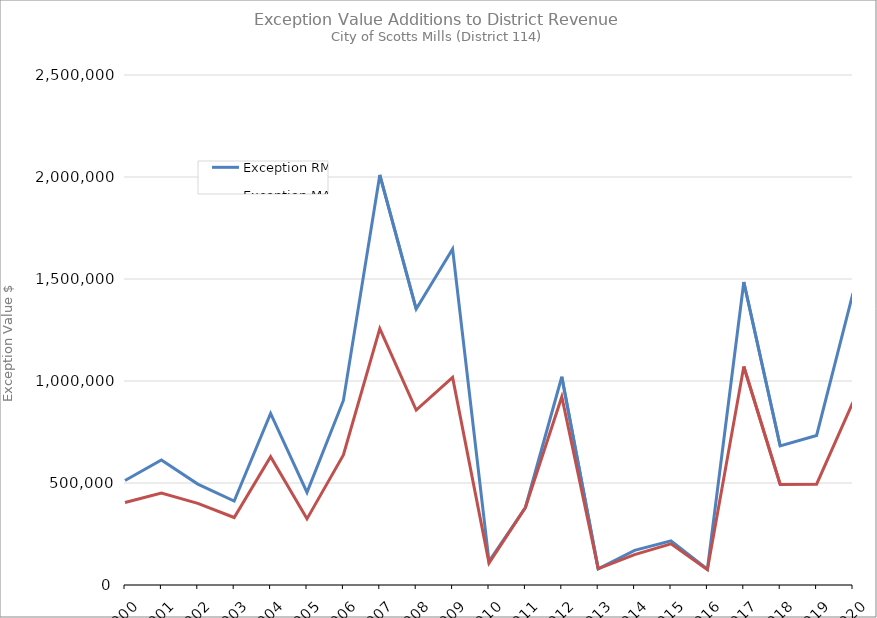
| Category | Exception RMV | Exception MAV |
|---|---|---|
| 2000.0 | 512547 | 404214 |
| 2001.0 | 612462 | 450982 |
| 2002.0 | 494777 | 400187 |
| 2003.0 | 411401 | 330771 |
| 2004.0 | 840740 | 629080 |
| 2005.0 | 454039 | 324179 |
| 2006.0 | 904565 | 637685 |
| 2007.0 | 2010086 | 1257116 |
| 2008.0 | 1352635 | 857515 |
| 2009.0 | 1646622 | 1017342 |
| 2010.0 | 116008 | 107378 |
| 2011.0 | 379928 | 379928 |
| 2012.0 | 1020955 | 923135 |
| 2013.0 | 79731 | 79291 |
| 2014.0 | 169965 | 149095 |
| 2015.0 | 216696 | 201996 |
| 2016.0 | 77688 | 74628 |
| 2017.0 | 1485171 | 1070981 |
| 2018.0 | 681442 | 492992 |
| 2019.0 | 733140 | 494420 |
| 2020.0 | 1430799 | 896459 |